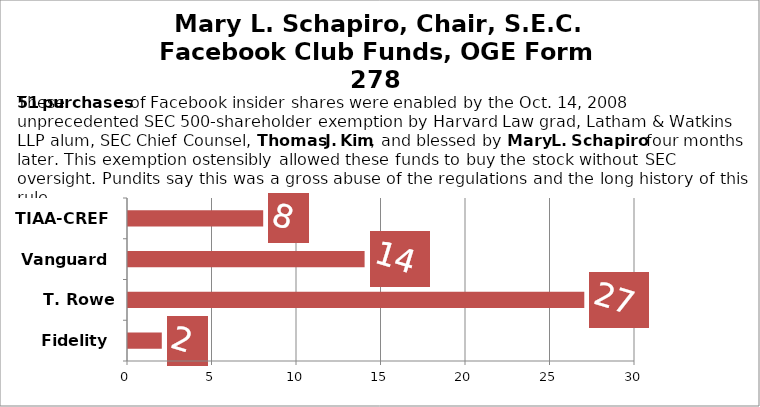
| Category | Series 0 |
|---|---|
| Fidelity | 2 |
| T. Rowe Price | 27 |
| Vanguard | 14 |
| TIAA-CREF | 8 |